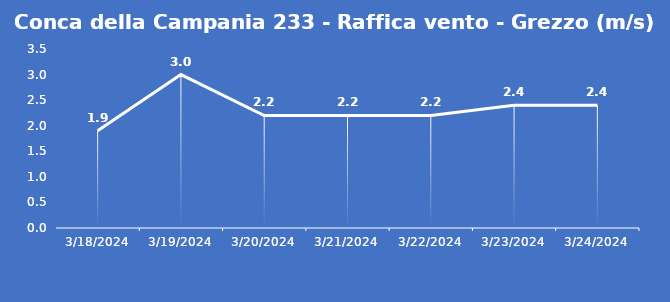
| Category | Conca della Campania 233 - Raffica vento - Grezzo (m/s) |
|---|---|
| 3/18/24 | 1.9 |
| 3/19/24 | 3 |
| 3/20/24 | 2.2 |
| 3/21/24 | 2.2 |
| 3/22/24 | 2.2 |
| 3/23/24 | 2.4 |
| 3/24/24 | 2.4 |